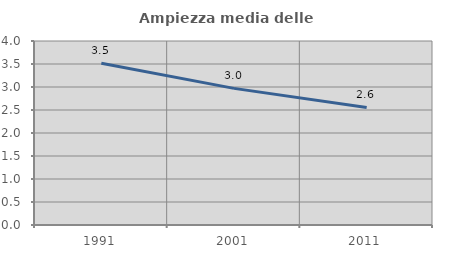
| Category | Ampiezza media delle famiglie |
|---|---|
| 1991.0 | 3.514 |
| 2001.0 | 2.97 |
| 2011.0 | 2.557 |